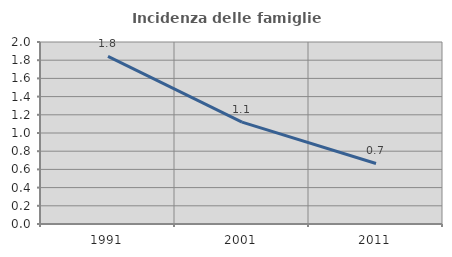
| Category | Incidenza delle famiglie numerose |
|---|---|
| 1991.0 | 1.843 |
| 2001.0 | 1.12 |
| 2011.0 | 0.665 |